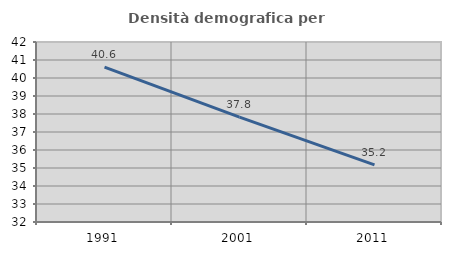
| Category | Densità demografica |
|---|---|
| 1991.0 | 40.603 |
| 2001.0 | 37.824 |
| 2011.0 | 35.176 |